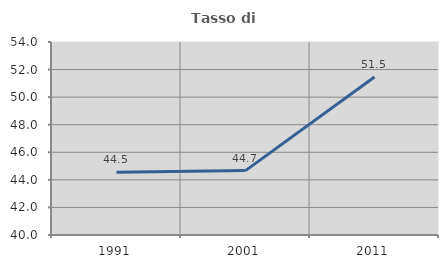
| Category | Tasso di occupazione   |
|---|---|
| 1991.0 | 44.545 |
| 2001.0 | 44.672 |
| 2011.0 | 51.46 |